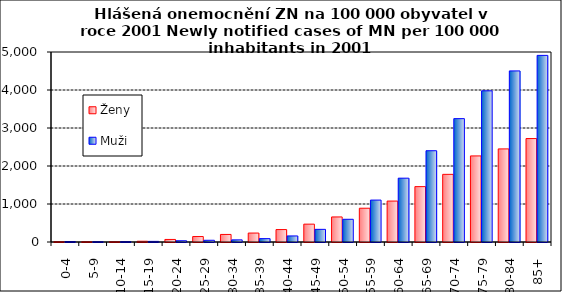
| Category | Ženy | Muži |
|---|---|---|
| 0-4 | 7.8 | 12.6 |
| 5-9 | 6.3 | 8.5 |
| 10-14 | 6 | 10.3 |
| 15-19 | 19.9 | 16.1 |
| 20-24 | 67.1 | 32.5 |
| 25-29 | 143.7 | 45.3 |
| 30-34 | 198.9 | 56.1 |
| 35-39 | 235.3 | 88.6 |
| 40-44 | 326.9 | 159.5 |
| 45-49 | 469.7 | 332.9 |
| 50-54 | 659.3 | 597.5 |
| 55-59 | 888.6 | 1102.9 |
| 60-64 | 1077.2 | 1679.6 |
| 65-69 | 1457.6 | 2402 |
| 70-74 | 1780.4 | 3246.4 |
| 75-79 | 2265.3 | 3978.3 |
| 80-84 | 2450 | 4502.3 |
| 85+ | 2722.4 | 4911 |